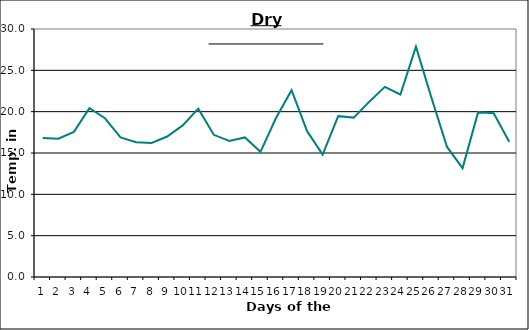
| Category | Series 0 |
|---|---|
| 0 | 16.8 |
| 1 | 16.72 |
| 2 | 17.55 |
| 3 | 20.42 |
| 4 | 19.2 |
| 5 | 16.89 |
| 6 | 16.31 |
| 7 | 16.22 |
| 8 | 16.99 |
| 9 | 18.34 |
| 10 | 20.36 |
| 11 | 17.2 |
| 12 | 16.46 |
| 13 | 16.88 |
| 14 | 15.14 |
| 15 | 19.23 |
| 16 | 22.6 |
| 17 | 17.64 |
| 18 | 14.8 |
| 19 | 19.46 |
| 20 | 19.28 |
| 21 | 21.21 |
| 22 | 23 |
| 23 | 22.08 |
| 24 | 27.86 |
| 25 | 21.67 |
| 26 | 15.73 |
| 27 | 13.17 |
| 28 | 19.94 |
| 29 | 19.8 |
| 30 | 16.37 |